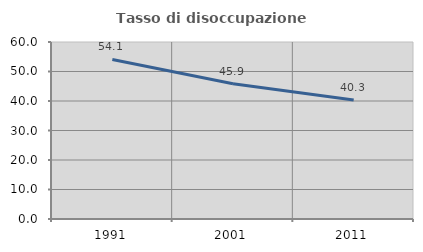
| Category | Tasso di disoccupazione giovanile  |
|---|---|
| 1991.0 | 54.088 |
| 2001.0 | 45.875 |
| 2011.0 | 40.333 |